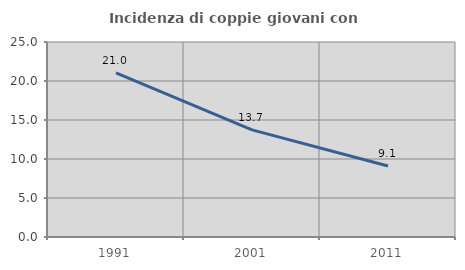
| Category | Incidenza di coppie giovani con figli |
|---|---|
| 1991.0 | 21.047 |
| 2001.0 | 13.735 |
| 2011.0 | 9.099 |